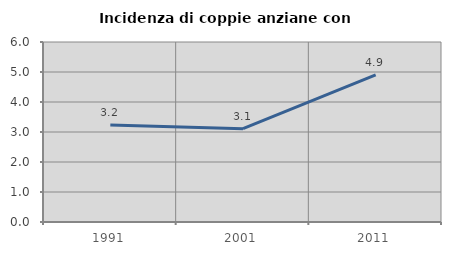
| Category | Incidenza di coppie anziane con figli |
|---|---|
| 1991.0 | 3.234 |
| 2001.0 | 3.111 |
| 2011.0 | 4.904 |